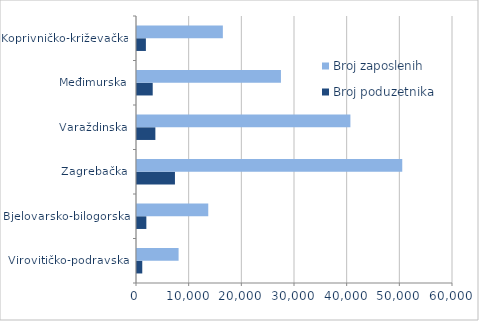
| Category | Broj poduzetnika | Broj zaposlenih |
|---|---|---|
| Virovitičko-podravska | 1000 | 7898 |
| Bjelovarsko-bilogorska | 1776 | 13530 |
| Zagrebačka | 7206 | 50365 |
| Varaždinska | 3488 | 40519 |
| Međimurska | 2983 | 27332 |
| Koprivničko-križevačka | 1688 | 16301 |